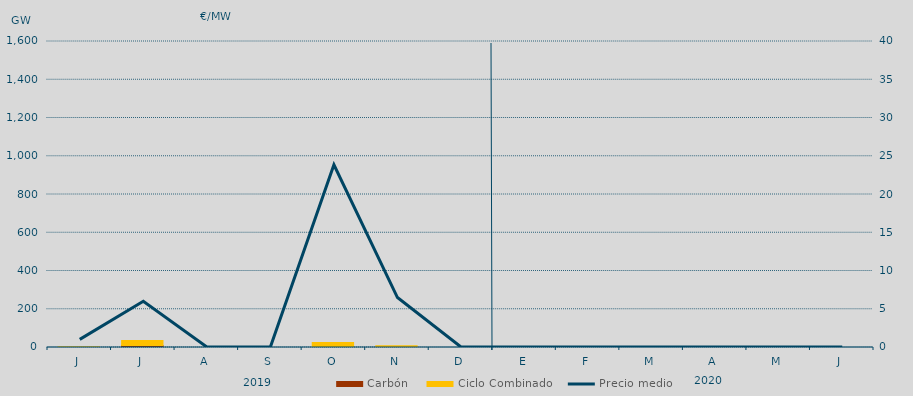
| Category | Carbón | Ciclo Combinado |
|---|---|---|
| J | 0 | 4200 |
| J | 10582.1 | 26246.2 |
| A | 0 | 0 |
| S | 0 | 0 |
| O | 0 | 25712.6 |
| N | 0 | 8552.1 |
| D | 0 | 0 |
| E | 0 | 0 |
| F | 0 | 0 |
| M | 0 | 0 |
| A | 0 | 0 |
| M | 0 | 0 |
| J | 0 | 0 |